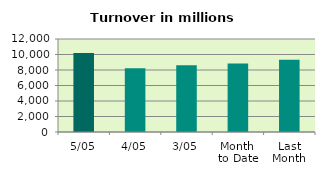
| Category | Series 0 |
|---|---|
| 5/05 | 10197.753 |
| 4/05 | 8225.847 |
| 3/05 | 8622.093 |
| Month 
to Date | 8840.818 |
| Last
Month | 9311.354 |